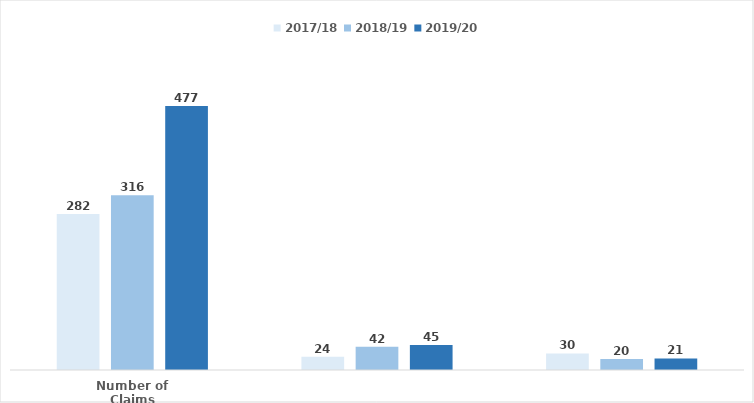
| Category | 2017/18 | 2018/19 | 2019/20 |
|---|---|---|---|
| Number of Claims | 282 | 316 | 477 |
| No. of Mandatory Reconsiderations | 24 | 42 | 45 |
| Number of Appeals | 30 | 20 | 21 |